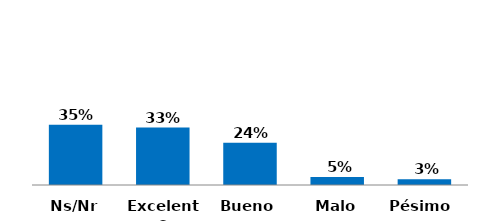
| Category | Series 0 |
|---|---|
| Pésimo  | 0.033 |
| Malo | 0.047 |
| Bueno | 0.243 |
| Excelente | 0.33 |
| Ns/Nr | 0.347 |